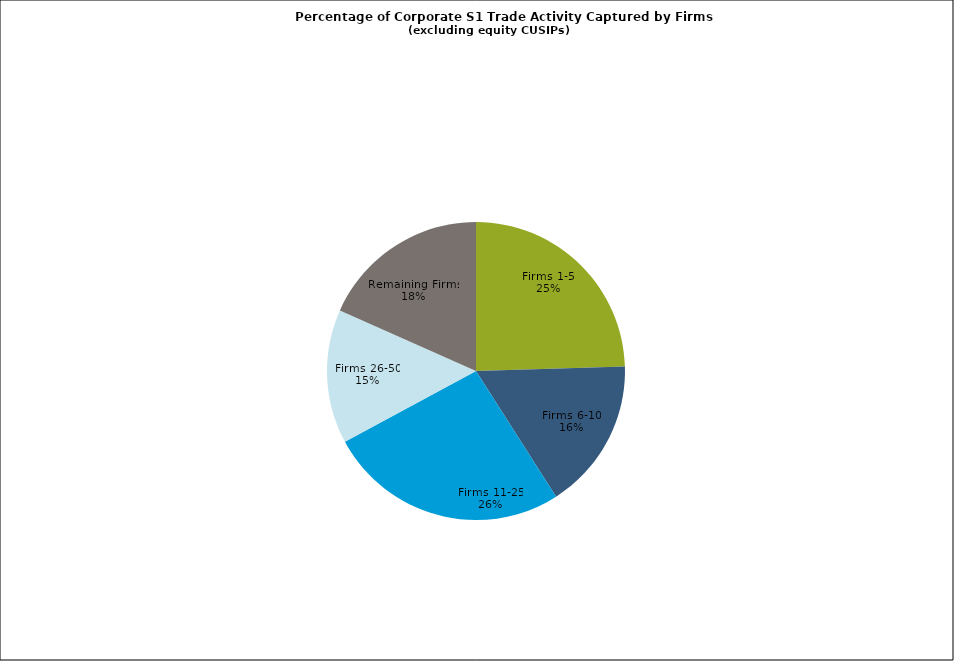
| Category | Series 0 |
|---|---|
| Firms 1-5 | 0.245 |
| Firms 6-10 | 0.164 |
| Firms 11-25 | 0.262 |
| Firms 26-50 | 0.146 |
| Remaining Firms | 0.183 |